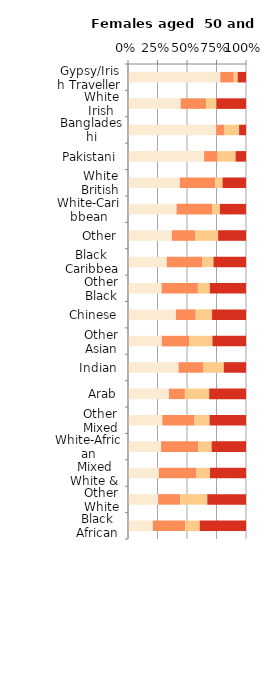
| Category | No qualifications | Below degree level qualifications | Other qualifications | Degree level qualifications |
|---|---|---|---|---|
| Gypsy/Irish Traveller | 78.206 | 11.422 | 3.269 | 7.103 |
| White Irish | 44.641 | 21.661 | 8.62 | 25.078 |
| Bangladeshi | 74.788 | 6.596 | 12.759 | 5.857 |
| Pakistani | 64.484 | 11.542 | 15.119 | 8.855 |
| White British | 43.96 | 30.075 | 6.042 | 19.924 |
| White-Caribbean | 41.198 | 30.077 | 6.662 | 22.062 |
| Other | 37.147 | 19.641 | 19.583 | 23.629 |
| Black Caribbean | 32.81 | 30.047 | 9.611 | 27.533 |
| Other Black | 28.414 | 30.836 | 10.077 | 30.674 |
| Chinese | 40.66 | 16.754 | 13.822 | 28.764 |
| Other Asian | 28.631 | 23.135 | 19.789 | 28.445 |
| Indian | 42.8 | 20.777 | 17.609 | 18.814 |
| Arab | 34.68 | 13.523 | 20.578 | 31.219 |
| Other Mixed | 29.103 | 27.311 | 12.696 | 30.889 |
| White-African | 28.06 | 31.524 | 11.308 | 29.108 |
| Mixed White & Asian | 26.059 | 31.99 | 11.461 | 30.489 |
| Other White | 25.514 | 18.648 | 23.025 | 32.813 |
| Black African | 21.032 | 27.397 | 12.359 | 39.212 |